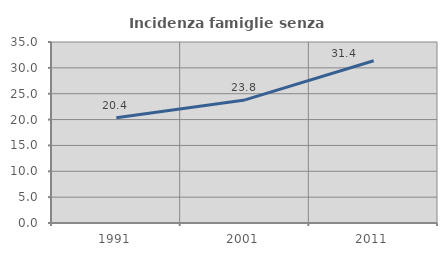
| Category | Incidenza famiglie senza nuclei |
|---|---|
| 1991.0 | 20.368 |
| 2001.0 | 23.8 |
| 2011.0 | 31.373 |